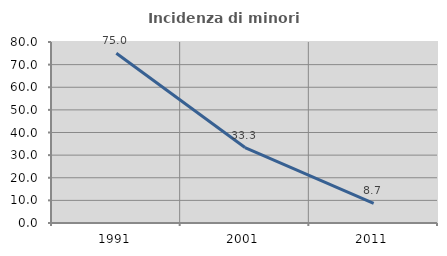
| Category | Incidenza di minori stranieri |
|---|---|
| 1991.0 | 75 |
| 2001.0 | 33.333 |
| 2011.0 | 8.696 |